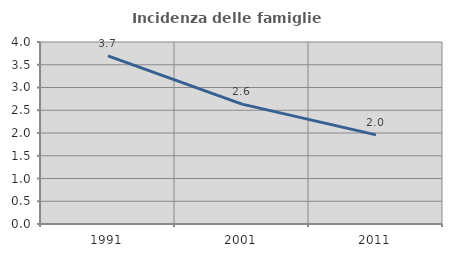
| Category | Incidenza delle famiglie numerose |
|---|---|
| 1991.0 | 3.694 |
| 2001.0 | 2.635 |
| 2011.0 | 1.958 |